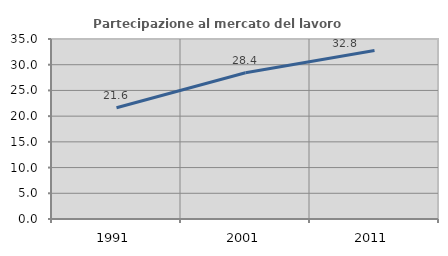
| Category | Partecipazione al mercato del lavoro  femminile |
|---|---|
| 1991.0 | 21.636 |
| 2001.0 | 28.426 |
| 2011.0 | 32.778 |